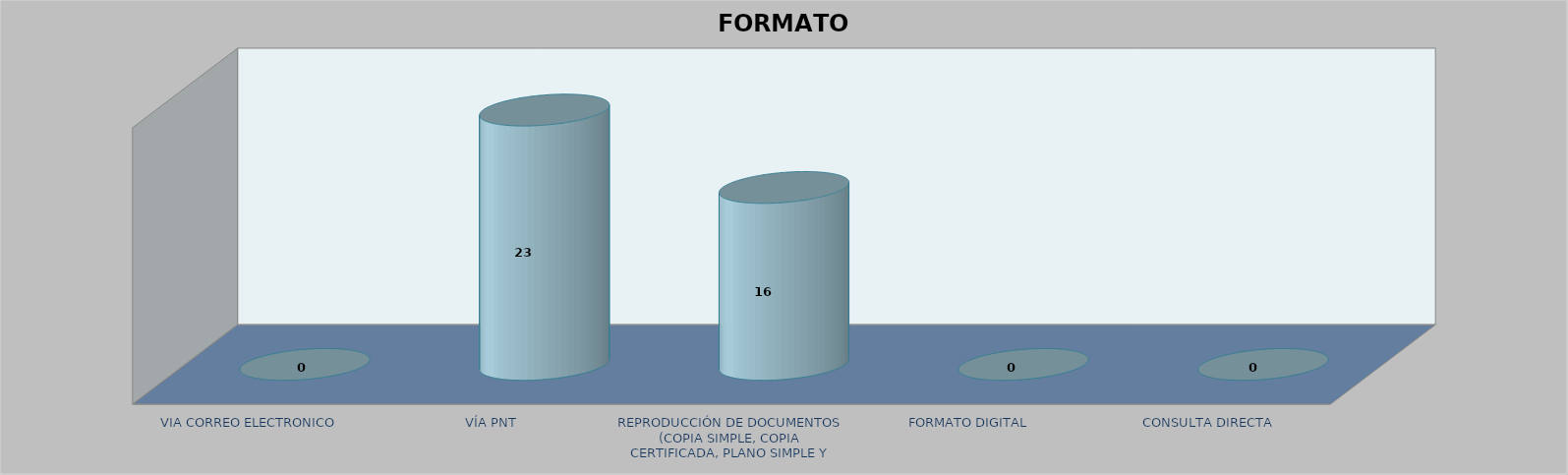
| Category |        FORMATO SOLICITADO | Series 1 | Series 2 |
|---|---|---|---|
| VIA CORREO ELECTRONICO |  |  | 0 |
| VÍA PNT |  |  | 23 |
| REPRODUCCIÓN DE DOCUMENTOS (COPIA SIMPLE, COPIA CERTIFICADA, PLANO SIMPLE Y PLANO CERTIFICADO) |  |  | 16 |
| FORMATO DIGITAL |  |  | 0 |
| CONSULTA DIRECTA |  |  | 0 |